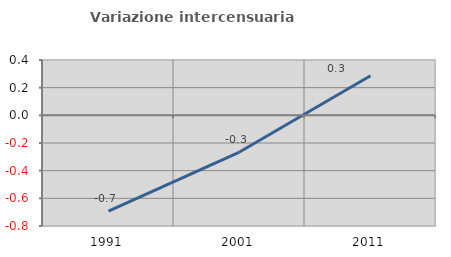
| Category | Variazione intercensuaria annua |
|---|---|
| 1991.0 | -0.692 |
| 2001.0 | -0.265 |
| 2011.0 | 0.286 |